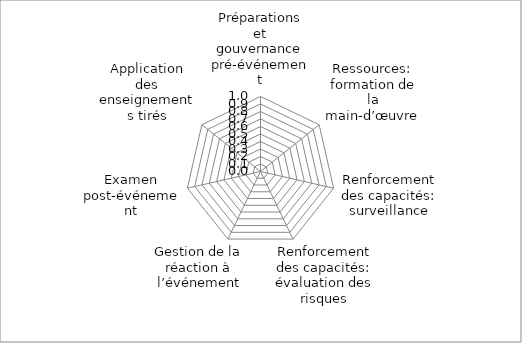
| Category | Series 0 |
|---|---|
| Préparations et gouvernance pré-événement | 0 |
| Ressources: formation de la main-d’œuvre | 0 |
| Renforcement des capacités: surveillance | 0 |
| Renforcement des capacités: évaluation des risques | 0 |
| Gestion de la réaction à l’événement | 0 |
| Examen post-événement | 0 |
| Application des enseignements tirés | 0 |